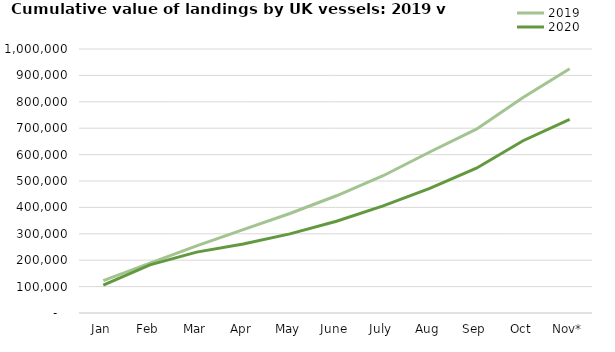
| Category | 2019 | 2020 |
|---|---|---|
| Jan | 122605.58 | 105304 |
| Feb | 188736.033 | 182229.17 |
| Mar | 254008.418 | 230592.975 |
| Apr | 315909.335 | 261568.644 |
| May | 376875.128 | 299835.731 |
| June | 444109.961 | 347505.735 |
| July | 519921.072 | 405948.098 |
| Aug | 609877.348 | 471823.999 |
| Sep | 696333.511 | 548303.732 |
| Oct | 816462.921 | 652495.544 |
| Nov* | 924872.345 | 733464.71 |